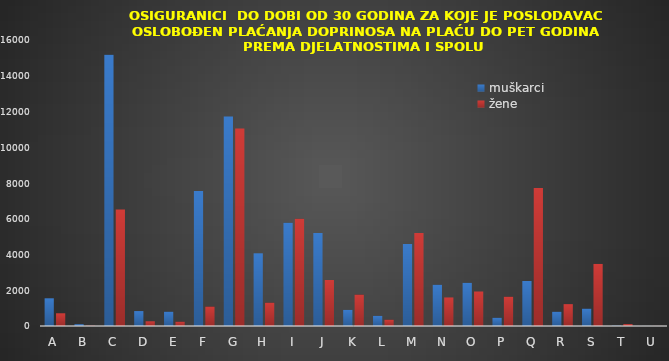
| Category | muškarci | žene |
|---|---|---|
| A | 1550 | 712 |
| B | 101 | 17 |
| C | 15175 | 6523 |
| D | 835 | 263 |
| E | 801 | 242 |
| F | 7556 | 1090 |
| G | 11723 | 11050 |
| H | 4067 | 1306 |
| I | 5778 | 5996 |
| J | 5205 | 2572 |
| K | 900 | 1759 |
| L | 566 | 354 |
| M | 4588 | 5202 |
| N | 2307 | 1597 |
| O | 2415 | 1930 |
| P | 460 | 1639 |
| Q | 2519 | 7722 |
| R | 798 | 1223 |
| S | 971 | 3472 |
| T | 17 | 108 |
| U | 3 | 5 |